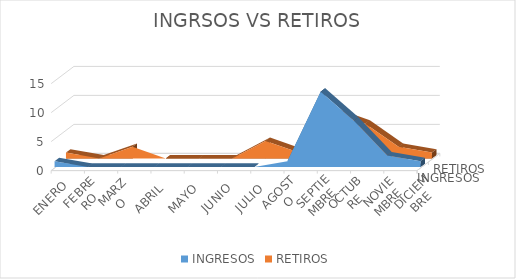
| Category | INGRESOS | RETIROS |
|---|---|---|
| ENERO | 1 | 1 |
| FEBRERO | 0 | 0 |
| MARZO  | 0 | 2 |
| ABRIL | 0 | 0 |
| MAYO | 0 | 0 |
| JUNIO | 0 | 0 |
| JULIO | 0 | 3 |
| AGOSTO | 1 | 1 |
| SEPTIEMBRE | 13 | 8 |
| OCTUBRE | 8 | 6 |
| NOVIEMBRE | 2 | 2 |
| DICIEMBRE | 1 | 1 |